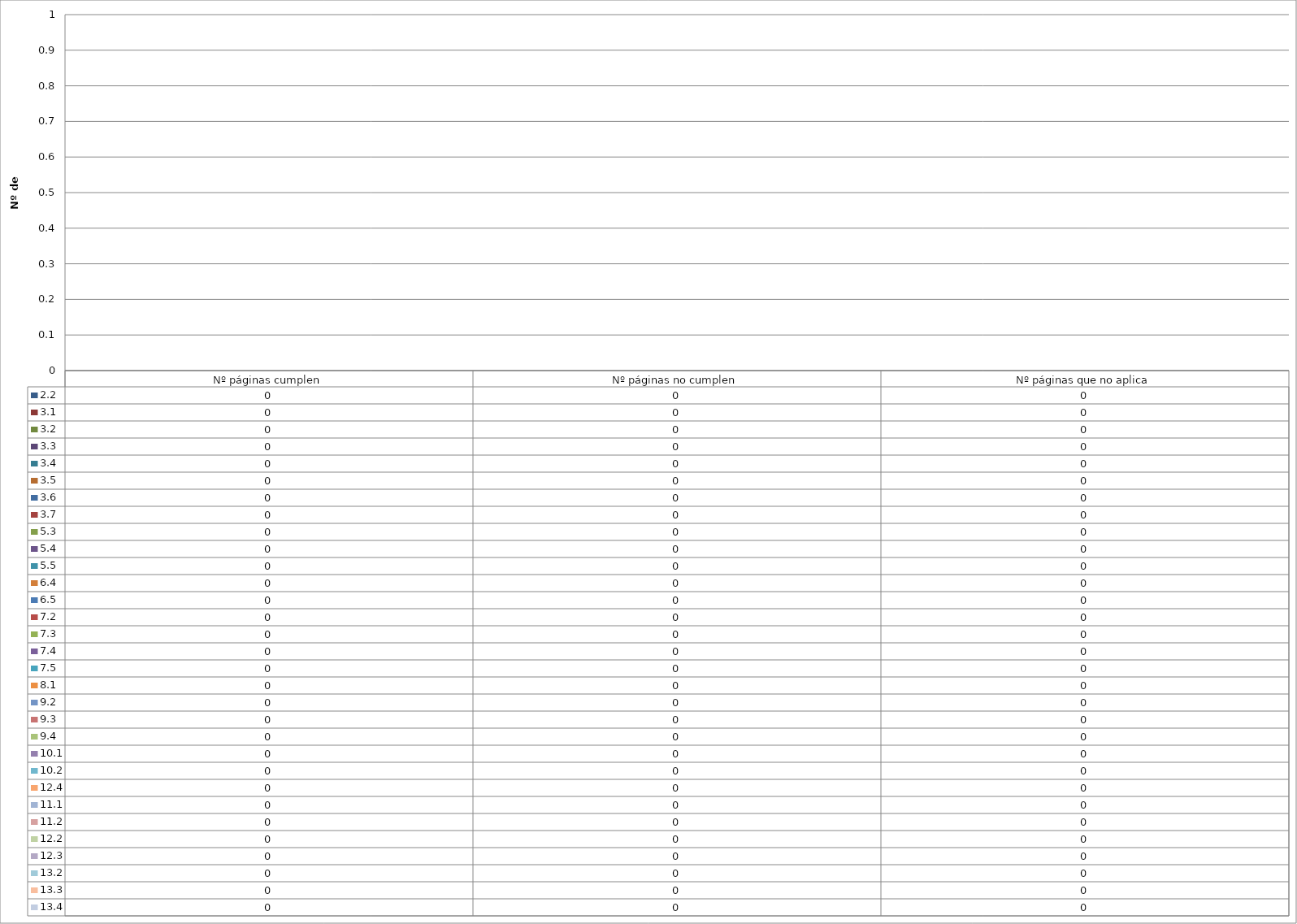
| Category | 2.2  | 3.1  | 3.2 | 3.3 | 3.4 | 3.5 | 3.6 | 3.7 | 5.3 | 5.4 | 5.5 | 6.4 | 6.5 | 7.2 | 7.3 | 7.4 | 7.5 | 8.1 | 9.2 | 9.3 | 9.4 | 10.1 | 10.2 | 12.4 | 11.1 | 11.2 | 12.2 | 12.3 | 13.2 | 13.3 | 13.4 |
|---|---|---|---|---|---|---|---|---|---|---|---|---|---|---|---|---|---|---|---|---|---|---|---|---|---|---|---|---|---|---|---|
| Nº páginas cumplen | 0 | 0 | 0 | 0 | 0 | 0 | 0 | 0 | 0 | 0 | 0 | 0 | 0 | 0 | 0 | 0 | 0 | 0 | 0 | 0 | 0 | 0 | 0 | 0 | 0 | 0 | 0 | 0 | 0 | 0 | 0 |
| Nº páginas no cumplen | 0 | 0 | 0 | 0 | 0 | 0 | 0 | 0 | 0 | 0 | 0 | 0 | 0 | 0 | 0 | 0 | 0 | 0 | 0 | 0 | 0 | 0 | 0 | 0 | 0 | 0 | 0 | 0 | 0 | 0 | 0 |
| Nº páginas que no aplica | 0 | 0 | 0 | 0 | 0 | 0 | 0 | 0 | 0 | 0 | 0 | 0 | 0 | 0 | 0 | 0 | 0 | 0 | 0 | 0 | 0 | 0 | 0 | 0 | 0 | 0 | 0 | 0 | 0 | 0 | 0 |